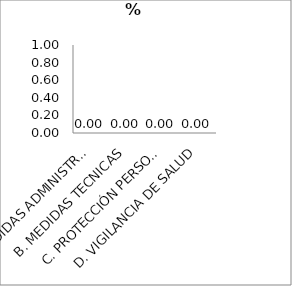
| Category | Series 0 |
|---|---|
| A. MEDIDAS ADMINISTRATIVAS | 0 |
| B. MEDIDAS TECNICAS | 0 |
| C. PROTECCIÓN PERSONAL | 0 |
| D. VIGILANCIA DE SALUD | 0 |